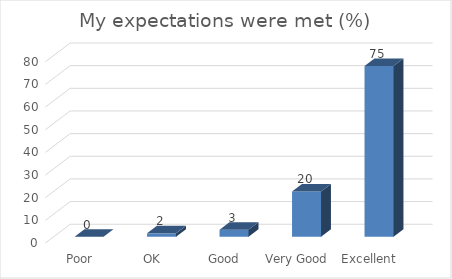
| Category | My expectations were met (%) |
|---|---|
| Poor | 0 |
| OK | 1.5 |
| Good | 3.1 |
| Very Good | 20 |
| Excellent | 75.4 |